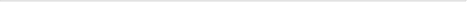
| Category | Series 0 |
|---|---|
| 379.0 | 825 |
| 386.0 | 783 |
| 462.0 | 656 |